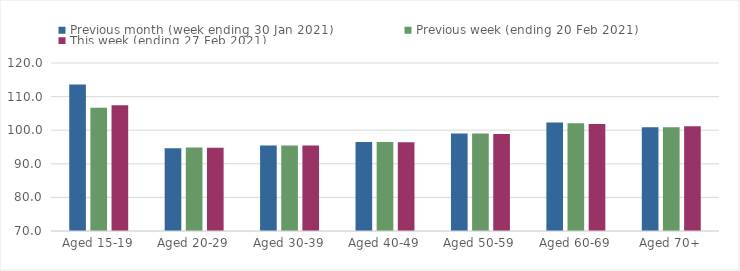
| Category | Previous month (week ending 30 Jan 2021) | Previous week (ending 20 Feb 2021) | This week (ending 27 Feb 2021) |
|---|---|---|---|
| Aged 15-19 | 113.63 | 106.71 | 107.45 |
| Aged 20-29 | 94.64 | 94.85 | 94.77 |
| Aged 30-39 | 95.45 | 95.46 | 95.42 |
| Aged 40-49 | 96.48 | 96.51 | 96.45 |
| Aged 50-59 | 99.01 | 99.04 | 98.9 |
| Aged 60-69 | 102.31 | 102.07 | 101.87 |
| Aged 70+ | 100.87 | 100.85 | 101.2 |